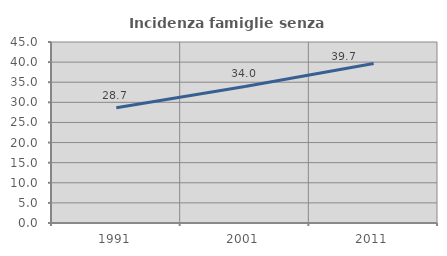
| Category | Incidenza famiglie senza nuclei |
|---|---|
| 1991.0 | 28.671 |
| 2001.0 | 33.955 |
| 2011.0 | 39.678 |